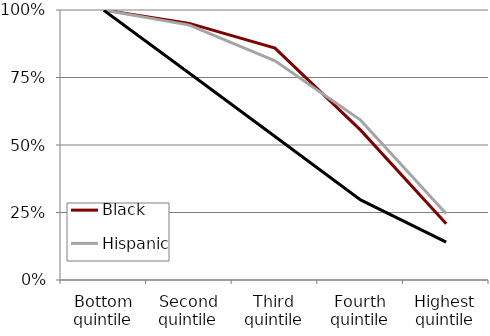
| Category | Black | Hispanic | White |
|---|---|---|---|
| Bottom quintile | 1 | 1 | 0.999 |
| Second quintile | 0.95 | 0.944 | 0.766 |
| Third quintile | 0.859 | 0.812 | 0.532 |
| Fourth quintile | 0.555 | 0.592 | 0.297 |
| Highest quintile | 0.209 | 0.245 | 0.14 |